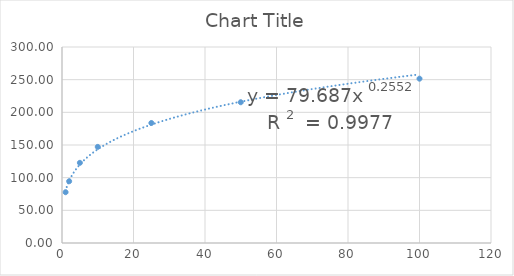
| Category | Series 0 |
|---|---|
| 1.0 | 77.742 |
| 2.0 | 94.51 |
| 5.0 | 122.711 |
| 10.0 | 147.101 |
| 25.0 | 183.685 |
| 50.0 | 215.443 |
| 100.0 | 251.519 |